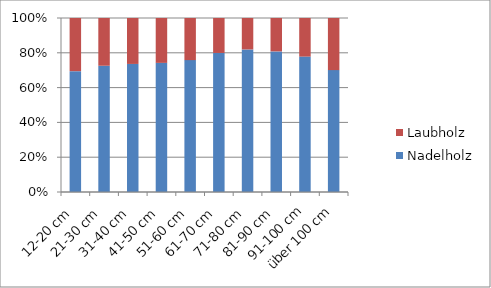
| Category | Nadelholz | Laubholz |
|---|---|---|
| 12-20 cm | 733000 | 322300 |
| 21-30 cm | 1549100 | 585700 |
| 31-40 cm | 2168000 | 777700 |
| 41-50 cm | 2634000 | 915200 |
| 51-60 cm | 2452300 | 783100 |
| 61-70 cm | 1270900 | 319400 |
| 71-80 cm | 566000 | 124800 |
| 81-90 cm | 194600 | 46200 |
| 91-100 cm | 66000 | 18800 |
| über 100 cm | 13100 | 5600 |